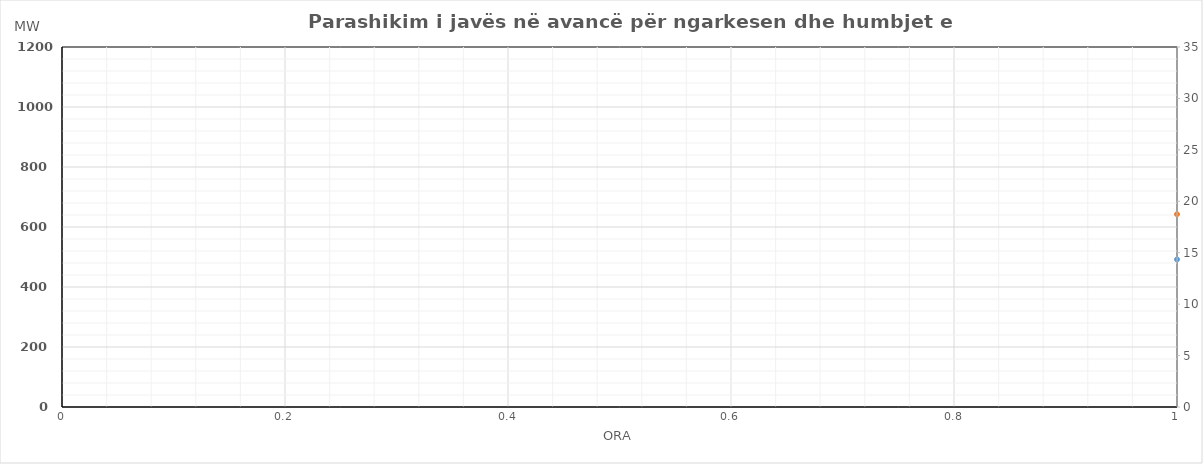
| Category | Ngarkesa (MWh) |
|---|---|
| 0 | 642.626 |
| 1 | 587.908 |
| 2 | 560.793 |
| 3 | 549.06 |
| 4 | 554.723 |
| 5 | 581.365 |
| 6 | 716.485 |
| 7 | 854.597 |
| 8 | 932.538 |
| 9 | 976.418 |
| 10 | 1001.446 |
| 11 | 1029.059 |
| 12 | 1031.742 |
| 13 | 1041.63 |
| 14 | 1039.328 |
| 15 | 1015.855 |
| 16 | 995.082 |
| 17 | 990.299 |
| 18 | 967.833 |
| 19 | 949.311 |
| 20 | 985.668 |
| 21 | 984.224 |
| 22 | 875.72 |
| 23 | 751.257 |
| 24 | 644.626 |
| 25 | 589.908 |
| 26 | 562.793 |
| 27 | 551.06 |
| 28 | 556.723 |
| 29 | 583.365 |
| 30 | 718.485 |
| 31 | 860.597 |
| 32 | 938.538 |
| 33 | 982.418 |
| 34 | 1007.446 |
| 35 | 1035.059 |
| 36 | 1037.742 |
| 37 | 1047.63 |
| 38 | 1045.328 |
| 39 | 1021.855 |
| 40 | 1001.082 |
| 41 | 996.299 |
| 42 | 973.833 |
| 43 | 955.311 |
| 44 | 991.668 |
| 45 | 990.224 |
| 46 | 881.72 |
| 47 | 757.257 |
| 48 | 657.39 |
| 49 | 603.038 |
| 50 | 578.096 |
| 51 | 564.511 |
| 52 | 578.002 |
| 53 | 612.946 |
| 54 | 701.745 |
| 55 | 830.69 |
| 56 | 921.868 |
| 57 | 953.762 |
| 58 | 953.32 |
| 59 | 972.914 |
| 60 | 979.282 |
| 61 | 978.454 |
| 62 | 959.251 |
| 63 | 942.096 |
| 64 | 932.14 |
| 65 | 940.449 |
| 66 | 939.813 |
| 67 | 917.414 |
| 68 | 949.059 |
| 69 | 951.882 |
| 70 | 854.437 |
| 71 | 724.109 |
| 72 | 620.768 |
| 73 | 567.011 |
| 74 | 541.508 |
| 75 | 536.4 |
| 76 | 542.325 |
| 77 | 577.885 |
| 78 | 713.413 |
| 79 | 845.039 |
| 80 | 914.987 |
| 81 | 936.588 |
| 82 | 953.752 |
| 83 | 976.815 |
| 84 | 979.799 |
| 85 | 972.169 |
| 86 | 949.674 |
| 87 | 930.937 |
| 88 | 936.198 |
| 89 | 946.301 |
| 90 | 927.563 |
| 91 | 918.571 |
| 92 | 953.565 |
| 93 | 958.621 |
| 94 | 866.306 |
| 95 | 735.045 |
| 96 | 661.39 |
| 97 | 607.038 |
| 98 | 582.096 |
| 99 | 568.511 |
| 100 | 582.002 |
| 101 | 616.946 |
| 102 | 705.745 |
| 103 | 834.69 |
| 104 | 925.868 |
| 105 | 957.762 |
| 106 | 957.32 |
| 107 | 976.914 |
| 108 | 986.282 |
| 109 | 985.454 |
| 110 | 966.251 |
| 111 | 949.096 |
| 112 | 939.14 |
| 113 | 947.449 |
| 114 | 946.813 |
| 115 | 924.414 |
| 116 | 956.059 |
| 117 | 958.882 |
| 118 | 861.437 |
| 119 | 731.109 |
| 120 | 651.59 |
| 121 | 595.883 |
| 122 | 561.24 |
| 123 | 548.647 |
| 124 | 550.874 |
| 125 | 585.007 |
| 126 | 657.38 |
| 127 | 789.363 |
| 128 | 862.744 |
| 129 | 919.5 |
| 130 | 949.489 |
| 131 | 972.193 |
| 132 | 979.53 |
| 133 | 992.686 |
| 134 | 984.477 |
| 135 | 960.936 |
| 136 | 950.455 |
| 137 | 957.474 |
| 138 | 961.818 |
| 139 | 948.167 |
| 140 | 977.974 |
| 141 | 976.431 |
| 142 | 865.27 |
| 143 | 730.42 |
| 144 | 665.541 |
| 145 | 615.937 |
| 146 | 585.679 |
| 147 | 567.57 |
| 148 | 582.92 |
| 149 | 612.844 |
| 150 | 702.909 |
| 151 | 812.839 |
| 152 | 902.125 |
| 153 | 936.954 |
| 154 | 959.446 |
| 155 | 971.224 |
| 156 | 969.024 |
| 157 | 963.382 |
| 158 | 934.074 |
| 159 | 907.733 |
| 160 | 911.584 |
| 161 | 929.197 |
| 162 | 954.903 |
| 163 | 953.521 |
| 164 | 979.422 |
| 165 | 965.882 |
| 166 | 867.64 |
| 167 | 752.588 |